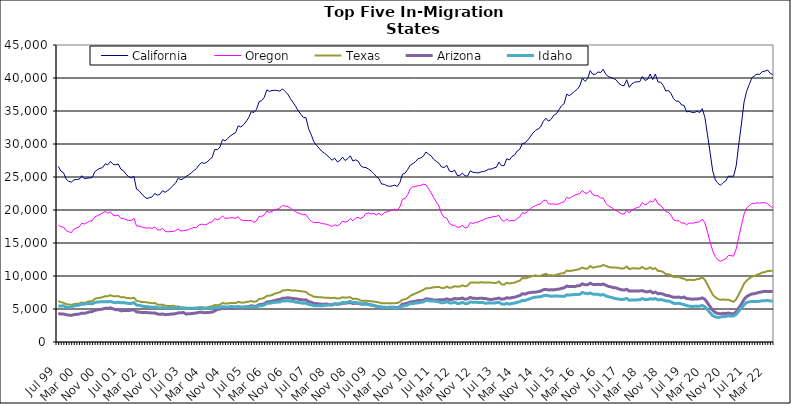
| Category | California | Oregon | Texas | Arizona | Idaho |
|---|---|---|---|---|---|
| Jul 99 | 26605 | 17749 | 6209 | 4339 | 5471 |
| Aug 99 | 25882 | 17447 | 6022 | 4228 | 5444 |
| Sep 99 | 25644 | 17401 | 5941 | 4237 | 5488 |
| Oct 99 | 24669 | 16875 | 5751 | 4134 | 5279 |
| Nov 99 | 24353 | 16701 | 5680 | 4073 | 5260 |
| Dec 99 | 24218 | 16570 | 5619 | 4042 | 5269 |
| Jan 00 | 24574 | 17109 | 5736 | 4142 | 5485 |
| Feb 00 | 24620 | 17295 | 5789 | 4192 | 5530 |
| Mar 00 | 24655 | 17436 | 5826 | 4226 | 5590 |
| Apr 00 | 25195 | 18009 | 5980 | 4375 | 5748 |
| May 00 | 24730 | 17875 | 5897 | 4337 | 5729 |
| Jun 00 | 24825 | 18113 | 6070 | 4444 | 5853 |
| Jul 00 | 24857 | 18294 | 6163 | 4555 | 5824 |
| Aug 00 | 24913 | 18376 | 6199 | 4603 | 5788 |
| Sep 00 | 25792 | 18971 | 6529 | 4804 | 5976 |
| Oct 00 | 26106 | 19135 | 6643 | 4870 | 6058 |
| Nov 00 | 26315 | 19306 | 6705 | 4926 | 6085 |
| Dec 00 | 26415 | 19570 | 6793 | 4991 | 6096 |
| Jan 01 | 26995 | 19781 | 6942 | 5122 | 6119 |
| Feb 01 | 26851 | 19519 | 6948 | 5089 | 6090 |
| Mar 01 | 27352 | 19720 | 7080 | 5180 | 6143 |
| Apr 01 | 26918 | 19221 | 6943 | 5020 | 6020 |
| May 01 | 26848 | 19126 | 6924 | 4899 | 5950 |
| Jun 01 | 26974 | 19241 | 6959 | 4895 | 6019 |
| Jul 01 | 26172 | 18725 | 6778 | 4737 | 5951 |
| Aug 01 | 25943 | 18736 | 6810 | 4757 | 5973 |
| Sep 01 | 25399 | 18514 | 6688 | 4753 | 5895 |
| Oct 01 | 25050 | 18415 | 6650 | 4780 | 5833 |
| Nov 01 | 24873 | 18381 | 6631 | 4826 | 5850 |
| Dec 01 | 25099 | 18765 | 6708 | 4898 | 5969 |
| Jan 02 | 23158 | 17561 | 6261 | 4560 | 5595 |
| Feb 02 | 22926 | 17573 | 6162 | 4531 | 5560 |
| Mar 02 | 22433 | 17452 | 6052 | 4481 | 5458 |
| Apr 02 | 22012 | 17314 | 6046 | 4458 | 5380 |
| May 02 | 21733 | 17267 | 6007 | 4452 | 5358 |
| Jun 02 | 21876 | 17298 | 5933 | 4444 | 5315 |
| Jul 02 | 21997 | 17209 | 5873 | 4383 | 5243 |
| Aug 02 | 22507 | 17436 | 5929 | 4407 | 5315 |
| Sep 02 | 22244 | 17010 | 5672 | 4248 | 5192 |
| Oct 02 | 22406 | 16952 | 5625 | 4191 | 5167 |
| Nov 02 | 22922 | 17223 | 5663 | 4242 | 5221 |
| Dec 02 | 22693 | 16770 | 5499 | 4142 | 5120 |
| Jan 03 | 22964 | 16694 | 5463 | 4166 | 5089 |
| Feb 03 | 23276 | 16727 | 5461 | 4226 | 5077 |
| Mar 03 | 23736 | 16766 | 5486 | 4251 | 5145 |
| Apr 03 | 24079 | 16859 | 5389 | 4289 | 5145 |
| May 03 | 24821 | 17117 | 5378 | 4415 | 5254 |
| Jun 03 | 24592 | 16812 | 5273 | 4426 | 5135 |
| Jul 03 | 24754 | 16875 | 5226 | 4466 | 5124 |
| Aug 03 | 25092 | 16922 | 5181 | 4244 | 5100 |
| Sep 03 | 25316 | 17036 | 5181 | 4279 | 5086 |
| Oct 03 | 25622 | 17228 | 5139 | 4301 | 5110 |
| Nov 03 | 25984 | 17335 | 5175 | 4362 | 5091 |
| Dec 03 | 26269 | 17350 | 5189 | 4396 | 5113 |
| Jan 04 | 26852 | 17734 | 5255 | 4492 | 5152 |
| Feb 04 | 27184 | 17860 | 5301 | 4502 | 5183 |
| Mar 04 | 27062 | 17757 | 5227 | 4443 | 5056 |
| Apr 04 | 27238 | 17840 | 5227 | 4461 | 5104 |
| May 04 | 27671 | 18113 | 5345 | 4493 | 5095 |
| Jun 04 | 27949 | 18201 | 5416 | 4532 | 5103 |
| Jul 04 | 29172 | 18727 | 5597 | 4697 | 5231 |
| Aug 04 | 29122 | 18529 | 5561 | 4945 | 5197 |
| Sep 04 | 29542 | 18678 | 5656 | 4976 | 5237 |
| Oct 04 | 30674 | 19108 | 5922 | 5188 | 5363 |
| Nov 04 | 30472 | 18716 | 5823 | 5106 | 5321 |
| Dec 04 | 30831 | 18755 | 5838 | 5135 | 5312 |
| Jan 05 | 31224 | 18823 | 5906 | 5155 | 5374 |
| Feb 05 | 31495 | 18842 | 5898 | 5168 | 5357 |
| Mar 05 | 31714 | 18738 | 5894 | 5212 | 5313 |
| Apr 05 | 32750 | 18998 | 6060 | 5340 | 5350 |
| May 05 | 32575 | 18504 | 5989 | 5269 | 5276 |
| Jun 05 | 32898 | 18414 | 5954 | 5252 | 5271 |
| Jul 05 | 33384 | 18395 | 6062 | 5322 | 5322 |
| Aug 05 | 33964 | 18381 | 6113 | 5375 | 5316 |
| Sep 05 | 34897 | 18426 | 6206 | 5493 | 5362 |
| Oct 05 | 34780 | 18132 | 6100 | 5408 | 5308 |
| Nov 05 | 35223 | 18332 | 6162 | 5434 | 5314 |
| Dec 05 | 36415 | 19047 | 6508 | 5658 | 5487 |
| Jan 06 | 36567 | 19032 | 6576 | 5688 | 5480 |
| Feb 06 | 37074 | 19257 | 6692 | 5792 | 5616 |
| Mar 06 | 38207 | 19845 | 6993 | 6052 | 5850 |
| Apr 06 | 37976 | 19637 | 7024 | 6101 | 5864 |
| May 06 | 38099 | 19781 | 7114 | 6178 | 5943 |
| Jun 06 | 38141 | 20061 | 7331 | 6276 | 6018 |
| Jul 06 | 38097 | 20111 | 7431 | 6399 | 6046 |
| Aug 06 | 38021 | 20333 | 7542 | 6450 | 6064 |
| Sep 06 | 38349 | 20686 | 7798 | 6627 | 6232 |
| Oct 06 | 37947 | 20591 | 7825 | 6647 | 6216 |
| Nov 06 | 37565 | 20526 | 7907 | 6707 | 6244 |
| Dec 06 | 36884 | 20272 | 7840 | 6648 | 6192 |
| Jan 07 | 36321 | 19984 | 7789 | 6597 | 6151 |
| Feb 07 | 35752 | 19752 | 7799 | 6554 | 6048 |
| Mar 07 | 35025 | 19547 | 7737 | 6487 | 5989 |
| Apr 07 | 34534 | 19412 | 7685 | 6430 | 5937 |
| May 07 | 34022 | 19296 | 7654 | 6353 | 5858 |
| Jun 07 | 33974 | 19318 | 7577 | 6390 | 5886 |
| Jul 07 | 32298 | 18677 | 7250 | 6117 | 5682 |
| Aug 07 | 31436 | 18322 | 7070 | 6034 | 5617 |
| Sep 07 | 30331 | 18087 | 6853 | 5847 | 5500 |
| Oct 07 | 29813 | 18108 | 6839 | 5821 | 5489 |
| Nov 07 | 29384 | 18105 | 6777 | 5769 | 5481 |
| Dec 07 | 28923 | 17949 | 6760 | 5733 | 5499 |
| Jan 08 | 28627 | 17890 | 6721 | 5732 | 5521 |
| Feb 08 | 28328 | 17834 | 6719 | 5749 | 5579 |
| Mar 08 | 27911 | 17680 | 6690 | 5650 | 5614 |
| Apr 08 | 27543 | 17512 | 6656 | 5612 | 5635 |
| May 08 | 27856 | 17754 | 6705 | 5774 | 5798 |
| Jun 08 | 27287 | 17589 | 6593 | 5717 | 5745 |
| Jul 08 | 27495 | 17834 | 6623 | 5761 | 5807 |
| Aug 08 | 28018 | 18309 | 6789 | 5867 | 5982 |
| Sep-08 | 27491 | 18164 | 6708 | 5864 | 5954 |
| Oct 08 | 27771 | 18291 | 6755 | 5942 | 6032 |
| Nov 08 | 28206 | 18706 | 6787 | 5970 | 6150 |
| Dec 08 | 27408 | 18353 | 6505 | 5832 | 5975 |
| Jan 09 | 27601 | 18778 | 6569 | 5890 | 5995 |
| Feb 09 | 27394 | 18863 | 6483 | 5845 | 5936 |
| Mar 09 | 26690 | 18694 | 6273 | 5751 | 5806 |
| Apr 09 | 26461 | 18943 | 6222 | 5735 | 5777 |
| May 09 | 26435 | 19470 | 6272 | 5819 | 5767 |
| Jun 09 | 26187 | 19522 | 6199 | 5700 | 5649 |
| Jul 09 | 25906 | 19408 | 6171 | 5603 | 5617 |
| Aug 09 | 25525 | 19469 | 6128 | 5533 | 5540 |
| Sep 09 | 25050 | 19249 | 6059 | 5405 | 5437 |
| Oct 09 | 24741 | 19529 | 6004 | 5349 | 5369 |
| Nov 09 | 23928 | 19187 | 5854 | 5271 | 5248 |
| Dec 09 | 23899 | 19607 | 5886 | 5261 | 5195 |
| Jan 10 | 23676 | 19703 | 5881 | 5232 | 5234 |
| Feb 10 | 23592 | 19845 | 5850 | 5272 | 5236 |
| Mar 10 | 23634 | 19946 | 5864 | 5278 | 5219 |
| Apr 10 | 23774 | 20134 | 5889 | 5257 | 5201 |
| May 10 | 23567 | 19966 | 5897 | 5172 | 5105 |
| Jun 10 | 24166 | 20464 | 6087 | 5356 | 5237 |
| Jul 10 | 25410 | 21627 | 6417 | 5742 | 5452 |
| Aug 10 | 25586 | 21744 | 6465 | 5797 | 5491 |
| Sep 10 | 26150 | 22314 | 6667 | 5907 | 5609 |
| Oct 10 | 26807 | 23219 | 6986 | 6070 | 5831 |
| Nov 10 | 27033 | 23520 | 7179 | 6100 | 5810 |
| Dec 10 | 27332 | 23551 | 7361 | 6182 | 5898 |
| Jan 11 | 27769 | 23697 | 7525 | 6276 | 5938 |
| Feb 11 | 27898 | 23718 | 7708 | 6267 | 6016 |
| Mar 11 | 28155 | 23921 | 7890 | 6330 | 6081 |
| Apr 11 | 28790 | 23847 | 8146 | 6544 | 6305 |
| May 11 | 28471 | 23215 | 8131 | 6502 | 6248 |
| Jun 11 | 28191 | 22580 | 8199 | 6445 | 6217 |
| Jul 11 | 27678 | 21867 | 8291 | 6368 | 6202 |
| Aug 11 | 27372 | 21203 | 8321 | 6356 | 6146 |
| Sep 11 | 27082 | 20570 | 8341 | 6387 | 6075 |
| Oct 11 | 26528 | 19442 | 8191 | 6402 | 5932 |
| Nov 11 | 26440 | 18872 | 8176 | 6426 | 5968 |
| Dec 11 | 26770 | 18784 | 8401 | 6533 | 6106 |
| Jan 12 | 25901 | 17963 | 8202 | 6390 | 5933 |
| Feb 12 | 25796 | 17718 | 8266 | 6456 | 5900 |
| Mar 12 | 26042 | 17647 | 8456 | 6600 | 6054 |
| Apr 12 | 25239 | 17386 | 8388 | 6534 | 5838 |
| May 12 | 25238 | 17407 | 8401 | 6558 | 5854 |
| Jun 12 | 25593 | 17673 | 8594 | 6669 | 6009 |
| Jul 12 | 25155 | 17237 | 8432 | 6474 | 5817 |
| Aug 12 | 25146 | 17391 | 8536 | 6539 | 5842 |
| Sep 12 | 25942 | 18102 | 8989 | 6759 | 6061 |
| Oct 12 | 25718 | 17953 | 9012 | 6618 | 6027 |
| Nov 12 | 25677 | 18134 | 9032 | 6611 | 6009 |
| Dec 12 | 25619 | 18166 | 8981 | 6601 | 5999 |
| Jan 13 | 25757 | 18344 | 9051 | 6627 | 5989 |
| Feb-13 | 25830 | 18512 | 9001 | 6606 | 5968 |
| Mar-13 | 25940 | 18689 | 9021 | 6577 | 5853 |
| Apr 13 | 26187 | 18844 | 9013 | 6478 | 5925 |
| May 13 | 26192 | 18884 | 9003 | 6431 | 5924 |
| Jun-13 | 26362 | 19013 | 8948 | 6508 | 5896 |
| Jul 13 | 26467 | 19037 | 8958 | 6559 | 5948 |
| Aug 13 | 27253 | 19198 | 9174 | 6655 | 6020 |
| Sep 13 | 26711 | 18501 | 8747 | 6489 | 5775 |
| Oct 13 | 26733 | 18301 | 8681 | 6511 | 5711 |
| Nov 13 | 27767 | 18620 | 8989 | 6709 | 5860 |
| Dec 13 | 27583 | 18320 | 8863 | 6637 | 5740 |
| Jan 14 | 28107 | 18409 | 8939 | 6735 | 5843 |
| Feb-14 | 28313 | 18383 | 8989 | 6779 | 5893 |
| Mar 14 | 28934 | 18696 | 9160 | 6918 | 6015 |
| Apr 14 | 29192 | 18946 | 9291 | 7036 | 6099 |
| May 14 | 30069 | 19603 | 9701 | 7314 | 6304 |
| Jun 14 | 30163 | 19487 | 9641 | 7252 | 6293 |
| Jul-14 | 30587 | 19754 | 9752 | 7415 | 6427 |
| Aug-14 | 31074 | 20201 | 9882 | 7499 | 6557 |
| Sep 14 | 31656 | 20459 | 9997 | 7536 | 6719 |
| Oct 14 | 32037 | 20663 | 10109 | 7555 | 6786 |
| Nov 14 | 32278 | 20825 | 9992 | 7628 | 6831 |
| Dec 14 | 32578 | 20918 | 10006 | 7705 | 6860 |
| Jan 15 | 33414 | 21396 | 10213 | 7906 | 7000 |
| Feb 15 | 33922 | 21518 | 10337 | 7982 | 7083 |
| Mar 15 | 33447 | 20942 | 10122 | 7891 | 7006 |
| Apr-15 | 33731 | 20893 | 10138 | 7906 | 6931 |
| May 15 | 34343 | 20902 | 10053 | 7895 | 6952 |
| Jun-15 | 34572 | 20870 | 10192 | 7973 | 6966 |
| Jul 15 | 35185 | 20916 | 10303 | 8000 | 6949 |
| Aug 15 | 35780 | 21115 | 10399 | 8126 | 6938 |
| Sep 15 | 36109 | 21246 | 10428 | 8207 | 6896 |
| Oct 15 | 37555 | 21908 | 10813 | 8477 | 7140 |
| Nov 15 | 37319 | 21750 | 10763 | 8390 | 7112 |
| Dec 15 | 37624 | 21990 | 10807 | 8395 | 7149 |
| Jan 16 | 37978 | 22248 | 10892 | 8388 | 7201 |
| Feb 16 | 38285 | 22369 | 10951 | 8508 | 7192 |
| Mar 16 | 38792 | 22506 | 11075 | 8547 | 7226 |
| Apr 16 | 39994 | 22999 | 11286 | 8815 | 7487 |
| May 16 | 39488 | 22548 | 11132 | 8673 | 7382 |
| Jun 16 | 39864 | 22556 | 11100 | 8682 | 7315 |
| Jul 16 | 41123 | 22989 | 11516 | 8903 | 7420 |
| Aug 16 | 40573 | 22333 | 11251 | 8731 | 7261 |
| Sep 16 | 40560 | 22162 | 11340 | 8692 | 7216 |
| Oct 16 | 40923 | 22172 | 11456 | 8742 | 7233 |
| Nov 16 | 40817 | 21818 | 11459 | 8685 | 7101 |
| Dec 16 | 41311 | 21815 | 11681 | 8783 | 7203 |
| Jan 17 | 40543 | 21029 | 11524 | 8609 | 6982 |
| Feb 17 | 40218 | 20613 | 11385 | 8416 | 6852 |
| Mar 17 | 40052 | 20425 | 11276 | 8354 | 6775 |
| Apr 17 | 39913 | 20147 | 11297 | 8218 | 6653 |
| May 17 | 39695 | 19910 | 11265 | 8196 | 6552 |
| Jun 17 | 39177 | 19650 | 11225 | 8034 | 6500 |
| Jul 17 | 38901 | 19419 | 11115 | 7923 | 6429 |
| Aug 17 | 38827 | 19389 | 11168 | 7867 | 6479 |
| Sep 17 | 39736 | 19936 | 11426 | 7991 | 6609 |
| Oct 17 | 38576 | 19547 | 11041 | 7708 | 6315 |
| Nov 17 | 39108 | 20013 | 11158 | 7746 | 6381 |
| Dec 17 | 39359 | 20202 | 11185 | 7743 | 6366 |
| Jan 18 | 39420 | 20362 | 11118 | 7736 | 6380 |
| Feb 18 | 39440 | 20476 | 11128 | 7741 | 6407 |
| Mar 18 | 40218 | 21106 | 11362 | 7789 | 6578 |
| Apr 18 | 39637 | 20788 | 11111 | 7642 | 6423 |
| May 18 | 39777 | 20933 | 11097 | 7591 | 6430 |
| Jun 18 | 40602 | 21381 | 11317 | 7721 | 6554 |
| Jul 18 | 39767 | 21189 | 11038 | 7445 | 6489 |
| Aug 18 | 40608 | 21729 | 11200 | 7560 | 6569 |
| Sep 18 | 39395 | 20916 | 10772 | 7318 | 6383 |
| Oct 18 | 39383 | 20724 | 10740 | 7344 | 6429 |
| Nov 18 | 38891 | 20265 | 10605 | 7255 | 6365 |
| Dec 18 | 38013 | 19741 | 10292 | 7069 | 6205 |
| Jan 19 | 38130 | 19643 | 10261 | 7032 | 6203 |
| Feb 19 | 37658 | 19237 | 10132 | 6892 | 6073 |
| Mar 19 | 36831 | 18492 | 9848 | 6766 | 5863 |
| Apr 19 | 36492 | 18349 | 9839 | 6763 | 5827 |
| May 19 | 36481 | 18407 | 9867 | 6809 | 5873 |
| Jun 19 | 35925 | 17998 | 9661 | 6698 | 5761 |
| Jul 19 | 35843 | 18049 | 9598 | 6800 | 5673 |
| Aug 19 | 34870 | 17785 | 9361 | 6577 | 5512 |
| Sep 19 | 34945 | 18038 | 9428 | 6547 | 5437 |
| Oct 19 | 34802 | 17977 | 9385 | 6483 | 5390 |
| Nov 19 | 34775 | 18072 | 9403 | 6511 | 5401 |
| Dec 19 | 34976 | 18140 | 9518 | 6521 | 5419 |
| Jan 20 | 34774 | 18209 | 9594 | 6561 | 5434 |
| Feb 20 | 35352 | 18632 | 9804 | 6682 | 5543 |
| Mar 20 | 34013 | 18041 | 9411 | 6464 | 5330 |
| Apr 20 | 31385 | 16629 | 8666 | 5922 | 4906 |
| May 20 | 28657 | 15123 | 7927 | 5355 | 4419 |
| Jun 20 | 25915 | 13817 | 7164 | 4815 | 3992 |
| Jul 20 | 24545 | 12926 | 6776 | 4457 | 3810 |
| Aug 20 | 24048 | 12443 | 6521 | 4326 | 3720 |
| Sep 20 | 23756 | 12258 | 6386 | 4266 | 3784 |
| Oct 20 | 24166 | 12429 | 6452 | 4347 | 3861 |
| Nov 20 | 24404 | 12597 | 6386 | 4324 | 3883 |
| Dec 20 | 25120 | 13122 | 6420 | 4394 | 3974 |
| Jan 21 | 25111 | 13080 | 6236 | 4304 | 3924 |
| Feb 21 | 25114 | 13015 | 6094 | 4260 | 3930 |
| Mar 21 | 26701 | 14096 | 6455 | 4567 | 4185 |
| Apr 21 | 29998 | 15978 | 7222 | 5164 | 4697 |
| May 21 | 33020 | 17641 | 7969 | 5748 | 5148 |
| Jun 21 | 36320 | 19369 | 8840 | 6450 | 5628 |
| Jul 21 | 37989 | 20320 | 9306 | 6877 | 5984 |
| Aug 21 | 39007 | 20657 | 9615 | 7094 | 6084 |
| Sep 21 | 40023 | 20974 | 9914 | 7277 | 6151 |
| Oct 21 | 40348 | 20966 | 10003 | 7327 | 6140 |
| Nov 21 | 40599 | 21096 | 10203 | 7437 | 6136 |
| Dec 21 | 40548 | 21032 | 10328 | 7532 | 6183 |
| Jan 22 | 40967 | 21106 | 10535 | 7618 | 6237 |
| Feb 22 | 41019 | 21125 | 10579 | 7673 | 6236 |
| Mar 22 | 41220 | 20949 | 10751 | 7660 | 6310 |
| Apr 22 | 40730 | 20602 | 10772 | 7661 | 6221 |
| May 22 | 40504 | 20370 | 10792 | 7636 | 6210 |